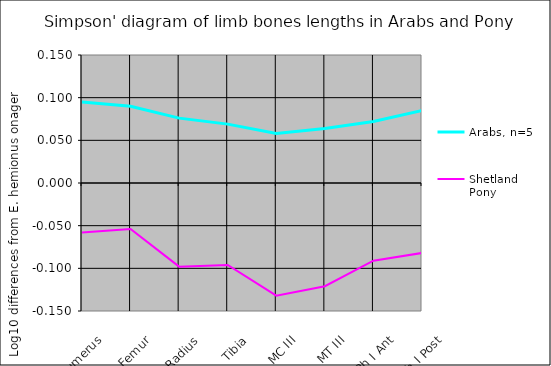
| Category | Arabs, n=5 | Shetland Pony |
|---|---|---|
| Humerus | 0.095 | -0.058 |
| Femur | 0.09 | -0.054 |
| Radius | 0.076 | -0.098 |
| Tibia | 0.069 | -0.096 |
| MC III | 0.058 | -0.132 |
| MT III | 0.064 | -0.121 |
| Ph I Ant | 0.072 | -0.091 |
| Ph I Post | 0.085 | -0.082 |